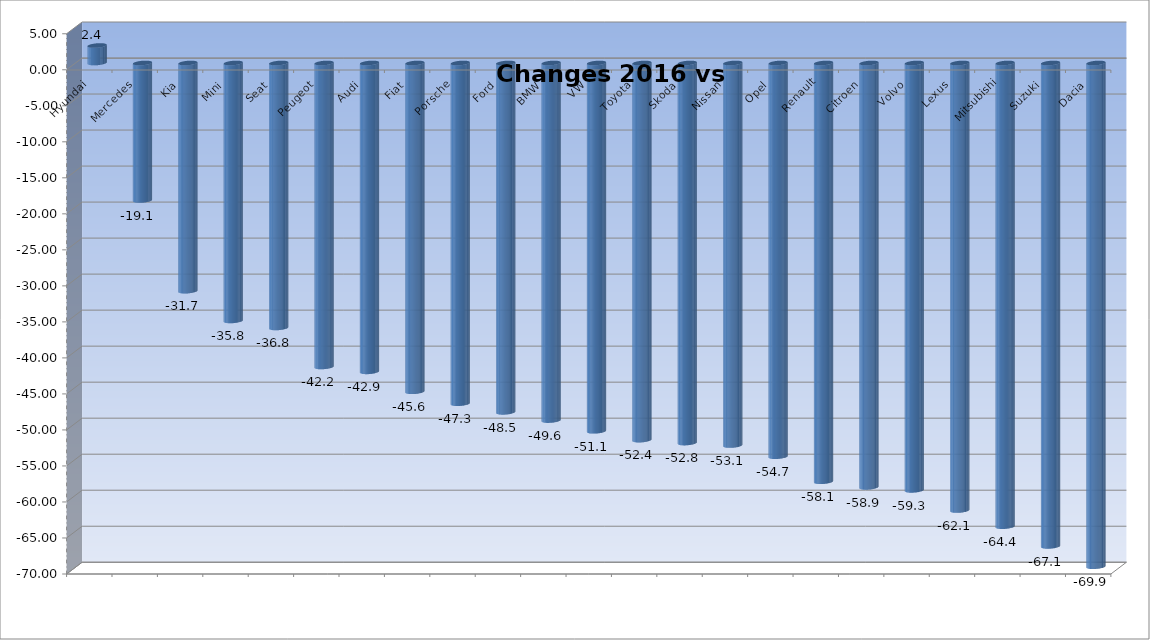
| Category | Ytd 2015 |
|---|---|
| Hyundai | 2.427 |
| Mercedes | -19.083 |
| Kia | -31.672 |
| Mini | -35.802 |
| Seat | -36.775 |
| Peugeot | -42.195 |
| Audi | -42.872 |
| Fiat | -45.636 |
| Porsche | -47.297 |
| Ford | -48.495 |
| BMW | -49.637 |
| VW | -51.125 |
| Toyota | -52.353 |
| Skoda | -52.76 |
| Nissan | -53.101 |
| Opel | -54.651 |
| Renault | -58.128 |
| Citroen | -58.909 |
| Volvo | -59.326 |
| Lexus | -62.121 |
| Mitsubishi | -64.368 |
| Suzuki | -67.105 |
| Dacia | -69.925 |